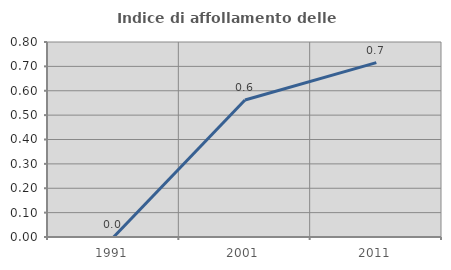
| Category | Indice di affollamento delle abitazioni  |
|---|---|
| 1991.0 | 0 |
| 2001.0 | 0.562 |
| 2011.0 | 0.716 |